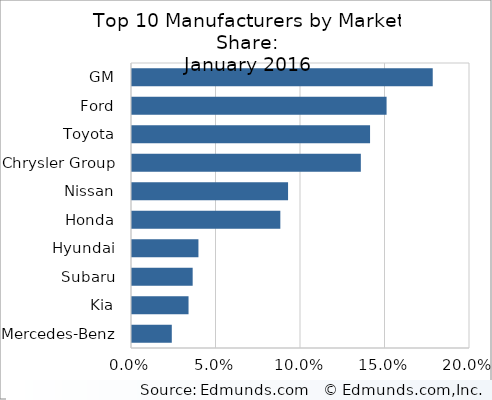
| Category | Series 0 |
|---|---|
| GM | 0.178 |
| Ford | 0.151 |
| Toyota | 0.141 |
| Chrysler Group | 0.135 |
| Nissan | 0.092 |
| Honda | 0.088 |
| Hyundai | 0.039 |
| Subaru | 0.036 |
| Kia | 0.033 |
| Mercedes-Benz | 0.024 |